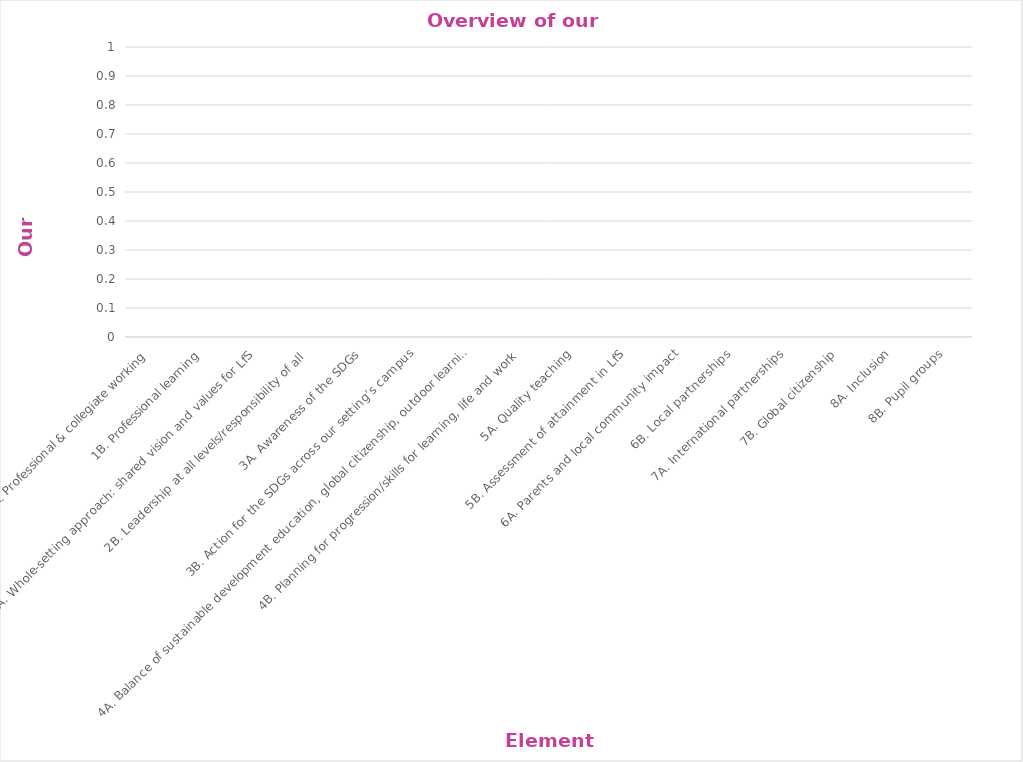
| Category | Series 0 |
|---|---|
| 1A. Professional & collegiate working | 0 |
| 1B. Professional learning | 0 |
| 2A. Whole-setting approach: shared vision and values for LfS | 0 |
| 2B. Leadership at all levels/responsibility of all | 0 |
| 3A. Awareness of the SDGs | 0 |
| 3B. Action for the SDGs across our setting’s campus | 0 |
| 4A. Balance of sustainable development education, global citizenship, outdoor learning | 0 |
| 4B. Planning for progression/skills for learning, life and work | 0 |
| 5A. Quality teaching | 0 |
| 5B. Assessment of attainment in LfS | 0 |
| 6A. Parents and local community impact | 0 |
| 6B. Local partnerships | 0 |
| 7A. International partnerships | 0 |
| 7B. Global citizenship | 0 |
| 8A. Inclusion | 0 |
| 8B. Pupil groups | 0 |